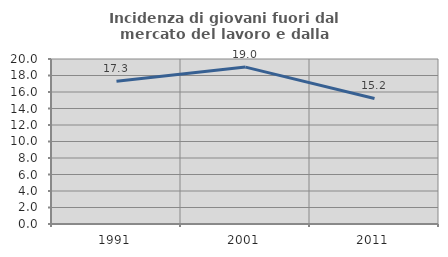
| Category | Incidenza di giovani fuori dal mercato del lavoro e dalla formazione  |
|---|---|
| 1991.0 | 17.3 |
| 2001.0 | 19.018 |
| 2011.0 | 15.214 |